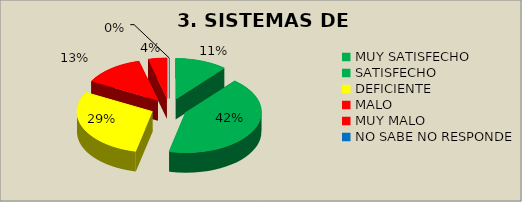
| Category | PORCENTAJES |
|---|---|
| MUY SATISFECHO | 0.11 |
| SATISFECHO | 0.42 |
| DEFICIENTE | 0.29 |
| MALO | 0.13 |
| MUY MALO | 0.04 |
| NO SABE NO RESPONDE | 0 |